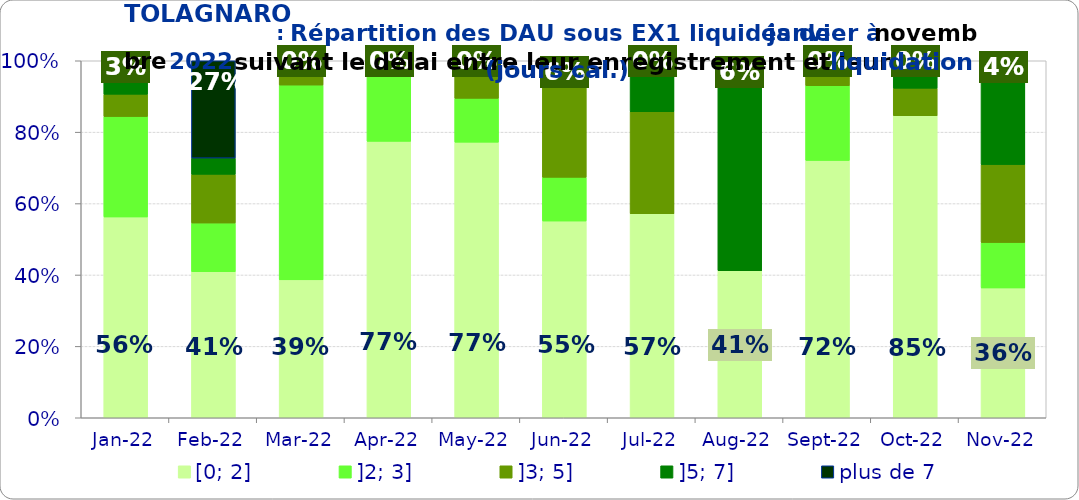
| Category | [0; 2] | ]2; 3] | ]3; 5] | ]5; 7] | plus de 7 |
|---|---|---|---|---|---|
| 2022-01-01 | 0.562 | 0.281 | 0.062 | 0.062 | 0.031 |
| 2022-02-01 | 0.409 | 0.136 | 0.136 | 0.045 | 0.273 |
| 2022-03-01 | 0.386 | 0.545 | 0.068 | 0 | 0 |
| 2022-04-01 | 0.774 | 0.194 | 0 | 0.032 | 0 |
| 2022-05-01 | 0.772 | 0.123 | 0.105 | 0 | 0 |
| 2022-06-01 | 0.551 | 0.122 | 0.265 | 0 | 0.061 |
| 2022-07-01 | 0.571 | 0 | 0.286 | 0.143 | 0 |
| 2022-08-01 | 0.412 | 0 | 0 | 0.529 | 0.059 |
| 2022-09-01 | 0.721 | 0.209 | 0.07 | 0 | 0 |
| 2022-10-01 | 0.846 | 0 | 0.077 | 0.077 | 0 |
| 2022-11-01 | 0.364 | 0.127 | 0.218 | 0.255 | 0.036 |